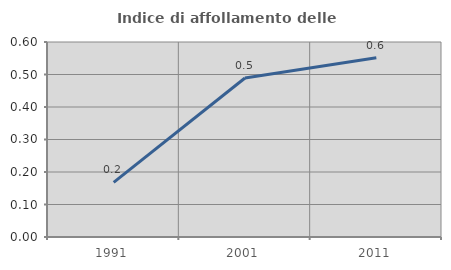
| Category | Indice di affollamento delle abitazioni  |
|---|---|
| 1991.0 | 0.168 |
| 2001.0 | 0.489 |
| 2011.0 | 0.552 |